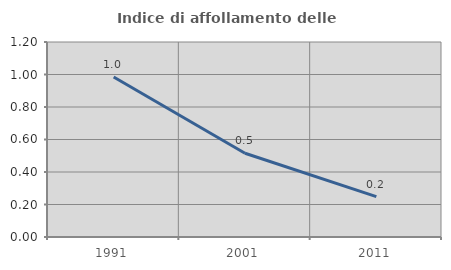
| Category | Indice di affollamento delle abitazioni  |
|---|---|
| 1991.0 | 0.984 |
| 2001.0 | 0.515 |
| 2011.0 | 0.249 |